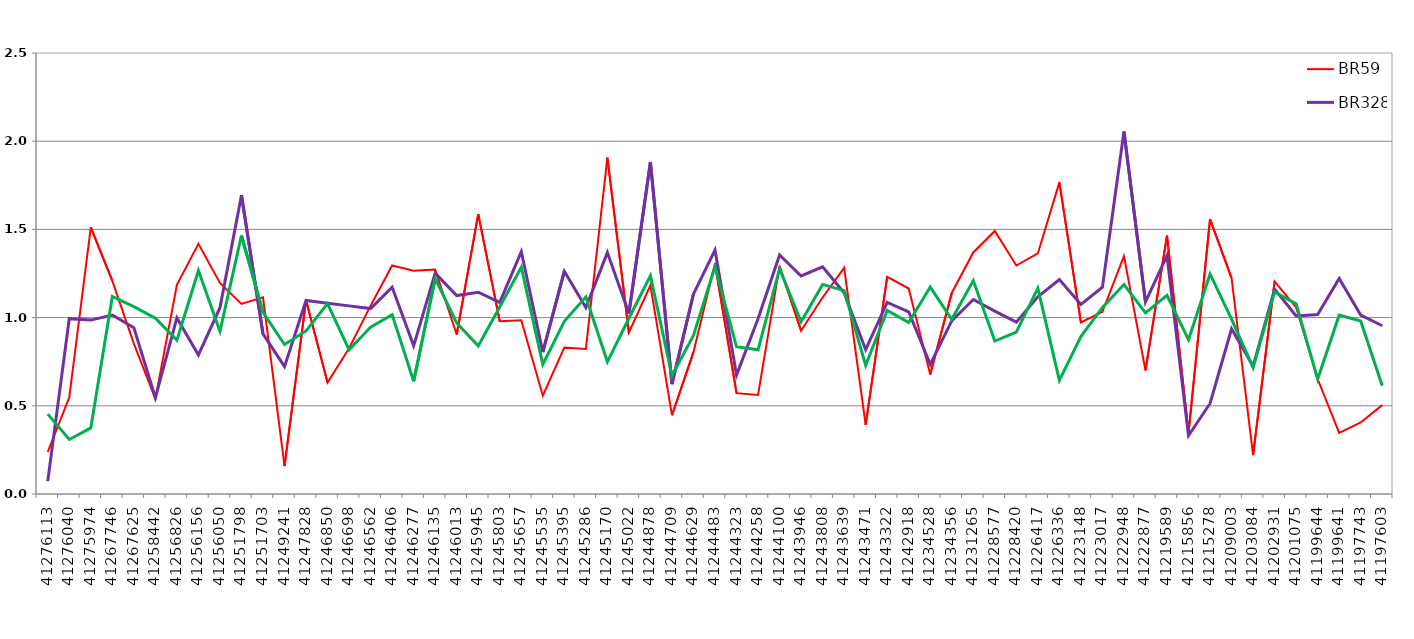
| Category | BR59 | BR328 | BR409 |
|---|---|---|---|
| 41276113.0 | 0.239 | 0.073 | 0.453 |
| 41276040.0 | 0.548 | 0.994 | 0.309 |
| 41275974.0 | 1.512 | 0.986 | 0.375 |
| 41267746.0 | 1.209 | 1.014 | 1.12 |
| 41267625.0 | 0.852 | 0.943 | 1.062 |
| 41258442.0 | 0.539 | 0.545 | 0.997 |
| 41256826.0 | 1.186 | 0.998 | 0.873 |
| 41256156.0 | 1.418 | 0.788 | 1.267 |
| 41256050.0 | 1.197 | 1.056 | 0.922 |
| 41251798.0 | 1.078 | 1.694 | 1.465 |
| 41251703.0 | 1.115 | 0.908 | 1.03 |
| 41249241.0 | 0.158 | 0.722 | 0.847 |
| 41247828.0 | 1.098 | 1.097 | 0.924 |
| 41246850.0 | 0.632 | 1.081 | 1.08 |
| 41246698.0 | 0.827 | 1.067 | 0.818 |
| 41246562.0 | 1.068 | 1.051 | 0.946 |
| 41246406.0 | 1.295 | 1.172 | 1.017 |
| 41246277.0 | 1.266 | 0.84 | 0.64 |
| 41246135.0 | 1.272 | 1.252 | 1.222 |
| 41246013.0 | 0.904 | 1.125 | 0.969 |
| 41245945.0 | 1.587 | 1.144 | 0.84 |
| 41245803.0 | 0.98 | 1.086 | 1.06 |
| 41245657.0 | 0.985 | 1.373 | 1.286 |
| 41245535.0 | 0.557 | 0.804 | 0.734 |
| 41245395.0 | 0.83 | 1.262 | 0.979 |
| 41245286.0 | 0.822 | 1.057 | 1.118 |
| 41245170.0 | 1.907 | 1.368 | 0.749 |
| 41245022.0 | 0.915 | 1.024 | 0.996 |
| 41244878.0 | 1.182 | 1.882 | 1.238 |
| 41244709.0 | 0.447 | 0.622 | 0.671 |
| 41244629.0 | 0.804 | 1.134 | 0.898 |
| 41244483.0 | 1.307 | 1.383 | 1.289 |
| 41244323.0 | 0.572 | 0.674 | 0.835 |
| 41244258.0 | 0.561 | 0.994 | 0.817 |
| 41244100.0 | 1.292 | 1.355 | 1.277 |
| 41243946.0 | 0.926 | 1.236 | 0.976 |
| 41243808.0 | 1.114 | 1.288 | 1.188 |
| 41243639.0 | 1.282 | 1.141 | 1.153 |
| 41243471.0 | 0.392 | 0.818 | 0.729 |
| 41243322.0 | 1.231 | 1.086 | 1.041 |
| 41242918.0 | 1.165 | 1.033 | 0.972 |
| 41234528.0 | 0.678 | 0.735 | 1.173 |
| 41234356.0 | 1.14 | 0.981 | 0.99 |
| 41231265.0 | 1.369 | 1.102 | 1.21 |
| 41228577.0 | 1.491 | 1.037 | 0.867 |
| 41228420.0 | 1.295 | 0.974 | 0.918 |
| 41226417.0 | 1.364 | 1.118 | 1.167 |
| 41226336.0 | 1.767 | 1.216 | 0.645 |
| 41223148.0 | 0.972 | 1.075 | 0.892 |
| 41223017.0 | 1.033 | 1.173 | 1.057 |
| 41222948.0 | 1.349 | 2.055 | 1.187 |
| 41222877.0 | 0.701 | 1.088 | 1.026 |
| 41219589.0 | 1.464 | 1.351 | 1.127 |
| 41215856.0 | 0.345 | 0.331 | 0.874 |
| 41215278.0 | 1.558 | 0.513 | 1.247 |
| 41209003.0 | 1.224 | 0.936 | 0.991 |
| 41203084.0 | 0.221 | 0.725 | 0.717 |
| 41202931.0 | 1.205 | 1.161 | 1.146 |
| 41201075.0 | 1.057 | 1.01 | 1.078 |
| 41199644.0 | 0.652 | 1.017 | 0.651 |
| 41199641.0 | 0.347 | 1.222 | 1.014 |
| 41197743.0 | 0.405 | 1.015 | 0.98 |
| 41197603.0 | 0.504 | 0.954 | 0.614 |